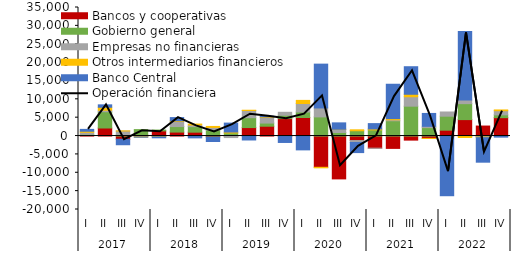
| Category | Bancos y cooperativas | Gobierno general | Empresas no financieras | Otros intermediarios financieros | Banco Central |
|---|---|---|---|---|---|
| 0 | 176.525 | 291.94 | 552.774 | 291.22 | 500.031 |
| 1 | 2191.03 | 4434.382 | 396.373 | 816.537 | 657.32 |
| 2 | -866.634 | 335.819 | 1034.76 | 24.217 | -1500.259 |
| 3 | 269.332 | 1484.954 | -199.227 | -72.562 | -26.614 |
| 4 | 1397.801 | 235.632 | -83.56 | -138.002 | -252.82 |
| 5 | 1077.762 | 1504.673 | 1370.624 | 199.386 | 872.22 |
| 6 | 1052.846 | 1509.857 | 448.531 | 245.395 | -495.87 |
| 7 | -306.499 | 1625.849 | 723.919 | 265.815 | -1185.782 |
| 8 | -21.106 | 828.073 | -393.541 | 266.245 | 2429.827 |
| 9 | 2308.815 | 2686.164 | 1961.172 | 72.751 | -1071.366 |
| 10 | 2677.373 | 853.875 | 1575.736 | 151.298 | 142.172 |
| 11 | 4750.727 | 906.93 | 807.522 | -129.803 | -1619.017 |
| 12 | 5043.509 | 1503.307 | 2309.269 | 853.036 | -3766.184 |
| 13 | -8509.202 | 5214.739 | 2437.834 | -146.306 | 11929.007 |
| 14 | -11666.258 | 962.307 | 872.727 | 23.024 | 1729.234 |
| 15 | -1230.751 | 1438.424 | -516.883 | 258.752 | -2759.208 |
| 16 | -3304.253 | 1670.011 | -20.372 | 260.495 | 1455.217 |
| 17 | -3361.381 | 4160.799 | 260.763 | 328.915 | 9354.292 |
| 18 | -1109.253 | 8132.548 | 2571.231 | 672.048 | 7500.376 |
| 19 | -639.184 | 2294.791 | 350.223 | -11.496 | 3508.969 |
| 20 | 1593.5 | 3814.868 | 1140.6 | -86.361 | -16162.137 |
| 21 | 4476.203 | 4344.794 | 984.301 | -389.6 | 18652.618 |
| 22 | 2721.849 | -170.501 | -143.069 | -127.942 | -6677.199 |
| 23 | 5005.331 | 765.426 | 1125.931 | 212.801 | -298.343 |